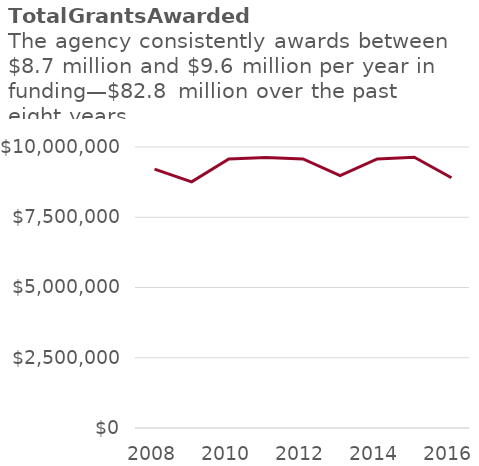
| Category | Total Grants Awarded |
|---|---|
| 2008.0 | 9212184 |
| 2009.0 | 8759456 |
| 2010.0 | 9576217 |
| 2011.0 | 9623374 |
| 2012.0 | 9576217 |
| 2013.0 | 8981046 |
| 2014.0 | 9576217 |
| 2015.0 | 9638564 |
| 2016.0 | 8906808 |